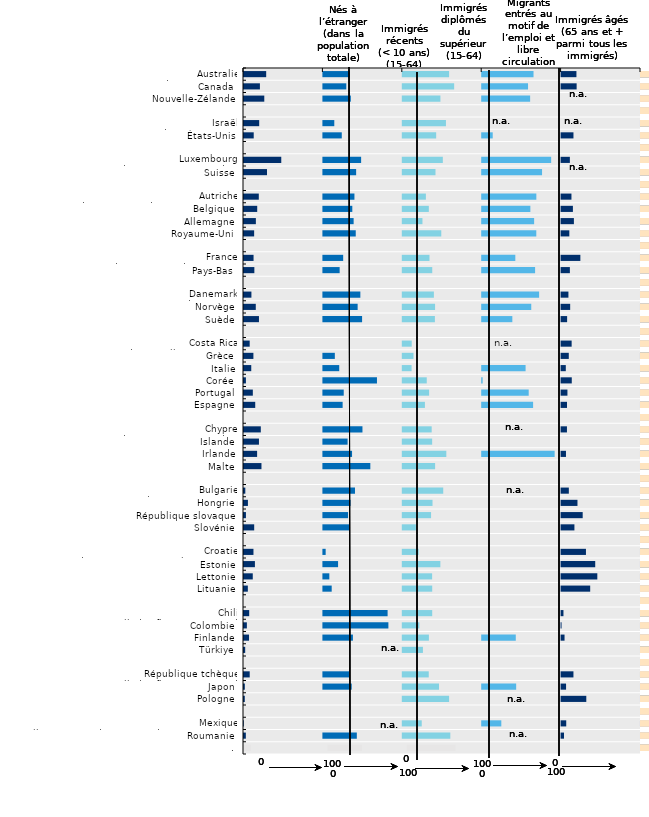
| Category | Nés à l’étranger (dans la
population
totale)
2021 | Series 9 | Immigrés
récents
(< 10 ans)
(15-64)
2020 | Series 13 | Immigrés
diplômés
du
supérieur (15-64)
2020 | Series 15 | Migrants
entrés au
motif de
l’emploi et
libre
circulation (2015-20) | Series 17 | Immigrés
âgés
(65 ans et
+) 2020 | Series 19 | Series 21 | Series 23 | Series 25 | Series 27 | Series 29 | Series 1 | Series 3 | Series 5 | Series 12 | Series 7 | Series 31 | Series 33 | Series 35 | Series 37 | Series 39 |
|---|---|---|---|---|---|---|---|---|---|---|---|---|---|---|---|---|---|---|---|---|---|---|---|---|---|
| 0 | 29.2 | 70.8 | 34.567 | 65.433 | 59.563 | 40.437 | 65.895 | 34.105 | 19.941 | 80.059 | 70.8 | 65.433 | 40.437 | 34.105 | 80.059 | 70.8 | 65.433 | 40.437 | 34.105 | 80.059 | 70.8 | 65.433 | 40.437 | 34.105 | 80.059 |
| 1 | 21.298 | 78.702 | 30.103 | 69.897 | 65.942 | 34.058 | 58.993 | 41.007 | 20.205 | 79.795 | 78.702 | 69.897 | 34.058 | 41.007 | 79.795 | 78.702 | 69.897 | 34.058 | 41.007 | 79.795 | 78.702 | 69.897 | 34.058 | 41.007 | 79.795 |
| 2 | 26.813 | 73.187 | 35.769 | 64.231 | 48.642 | 51.358 | 61.633 | 38.367 | 0 | 100 | 73.187 | 64.231 | 51.358 | 38.367 | 100 | 73.187 | 64.231 | 51.358 | 38.367 | 100 | 73.187 | 64.231 | 51.358 | 38.367 | 100 |
| 3 | 0 | 100 | 0 | 100 | 0 | 100 | 0 | 100 | 0 | 100 | 100 | 100 | 100 | 100 | 100 | 100 | 100 | 100 | 100 | 100 | 100 | 100 | 100 | 100 | 100 |
| 4 | 20.4 | 79.6 | 14.974 | 85.026 | 55.59 | 44.41 | 0 | 100 | 0 | 100 | 79.6 | 85.026 | 44.41 | 100 | 100 | 79.6 | 85.026 | 44.41 | 100 | 100 | 79.6 | 85.026 | 44.41 | 100 | 100 |
| 5 | 13.5 | 86.5 | 24.397 | 75.603 | 43.287 | 56.713 | 14.513 | 85.487 | 16.2 | 83.8 | 86.5 | 75.603 | 56.713 | 85.487 | 83.8 | 86.5 | 75.603 | 56.713 | 85.487 | 83.8 | 86.5 | 75.603 | 56.713 | 85.487 | 83.8 |
| 6 | 0 | 100 | 0 | 100 | 0 | 100 | 0 | 100 | 0 | 100 | 100 | 100 | 100 | 100 | 100 | 100 | 100 | 100 | 100 | 100 | 100 | 100 | 100 | 100 | 100 |
| 7 | 48.2 | 51.8 | 48.771 | 51.229 | 51.677 | 48.323 | 88.115 | 11.885 | 11.675 | 88.325 | 51.8 | 51.229 | 48.323 | 11.885 | 88.325 | 51.8 | 51.229 | 48.323 | 11.885 | 88.325 | 51.8 | 51.229 | 48.323 | 11.885 | 88.325 |
| 8 | 30.2 | 69.8 | 42.49 | 57.51 | 42.431 | 57.569 | 76.639 | 23.361 | 0 | 100 | 69.8 | 57.51 | 57.569 | 23.361 | 100 | 69.8 | 57.51 | 57.569 | 23.361 | 100 | 69.8 | 57.51 | 57.569 | 23.361 | 100 |
| 9 | 0 | 100 | 0 | 100 | 0 | 100 | 0 | 100 | 0 | 100 | 100 | 100 | 100 | 100 | 100 | 100 | 100 | 100 | 100 | 100 | 100 | 100 | 100 | 100 | 100 |
| 10 | 19.9 | 80.1 | 40.346 | 59.654 | 30.329 | 69.671 | 69.449 | 30.551 | 13.67 | 86.33 | 80.1 | 59.654 | 69.671 | 30.551 | 86.33 | 80.1 | 59.654 | 69.671 | 30.551 | 86.33 | 80.1 | 59.654 | 69.671 | 30.551 | 86.33 |
| 11 | 17.9 | 82.1 | 37.666 | 62.334 | 34.037 | 65.963 | 61.92 | 38.08 | 15.49 | 84.51 | 82.1 | 62.334 | 65.963 | 38.08 | 84.51 | 82.1 | 62.334 | 65.963 | 38.08 | 84.51 | 82.1 | 62.334 | 65.963 | 38.08 | 84.51 |
| 12 | 16.2 | 83.8 | 39.337 | 60.663 | 26.01 | 73.99 | 66.656 | 33.344 | 16.755 | 83.245 | 83.8 | 60.663 | 73.99 | 33.344 | 83.245 | 83.8 | 60.663 | 73.99 | 33.344 | 83.245 | 83.8 | 60.663 | 73.99 | 33.344 | 83.245 |
| 13 | 14.041 | 85.959 | 42.001 | 57.999 | 49.718 | 50.282 | 69.389 | 30.611 | 10.99 | 89.01 | 85.959 | 57.999 | 50.282 | 30.611 | 89.01 | 85.959 | 57.999 | 50.282 | 30.611 | 89.01 | 85.959 | 57.999 | 50.282 | 30.611 | 89.01 |
| 14 | 0 | 100 | 0 | 100 | 0 | 100 | 0 | 100 | 0 | 100 | 100 | 100 | 100 | 100 | 100 | 100 | 100 | 100 | 100 | 100 | 100 | 100 | 100 | 100 | 100 |
| 15 | 13.3 | 86.7 | 26.167 | 73.833 | 34.879 | 65.121 | 42.972 | 57.028 | 24.892 | 75.108 | 86.7 | 73.833 | 65.121 | 57.028 | 75.108 | 86.7 | 73.833 | 65.121 | 57.028 | 75.108 | 86.7 | 73.833 | 65.121 | 57.028 | 75.108 |
| 16 | 14.3 | 85.7 | 21.73 | 78.27 | 38.354 | 61.646 | 67.884 | 32.116 | 11.681 | 88.319 | 85.7 | 78.27 | 61.646 | 32.116 | 88.319 | 85.7 | 78.27 | 61.646 | 32.116 | 88.319 | 85.7 | 78.27 | 61.646 | 32.116 | 88.319 |
| 17 | 0 | 100 | 0 | 100 | 0 | 100 | 0 | 100 | 0 | 100 | 100 | 100 | 100 | 100 | 100 | 100 | 100 | 100 | 100 | 100 | 100 | 100 | 100 | 100 | 100 |
| 18 | 10.6 | 89.4 | 47.784 | 52.216 | 40.398 | 59.602 | 72.948 | 27.052 | 9.853 | 90.147 | 89.4 | 52.216 | 59.602 | 27.052 | 90.147 | 89.4 | 52.216 | 59.602 | 27.052 | 90.147 | 89.4 | 52.216 | 59.602 | 27.052 | 90.147 |
| 19 | 16.1 | 83.9 | 44.393 | 55.607 | 41.906 | 58.094 | 63.045 | 36.955 | 12.054 | 87.946 | 83.9 | 55.607 | 58.094 | 36.955 | 87.946 | 83.9 | 55.607 | 58.094 | 36.955 | 87.946 | 83.9 | 55.607 | 58.094 | 36.955 | 87.946 |
| 20 | 20.1 | 79.9 | 49.997 | 50.003 | 41.668 | 58.332 | 39.213 | 60.787 | 8.213 | 91.787 | 79.9 | 50.003 | 58.332 | 60.787 | 91.787 | 79.9 | 50.003 | 58.332 | 60.787 | 91.787 | 79.9 | 50.003 | 58.332 | 60.787 | 91.787 |
| 21 | 0 | 100 | 0 | 100 | 0 | 100 | 0 | 100 | 0 | 100 | 100 | 100 | 100 | 100 | 100 | 100 | 100 | 100 | 100 | 100 | 100 | 100 | 100 | 100 | 100 |
| 22 | 8.43 | 91.57 | 0 | 100 | 12.5 | 87.5 | 0 | 100 | 13.911 | 86.089 | 91.57 | 100 | 87.5 | 100 | 86.089 | 91.57 | 100 | 87.5 | 100 | 86.089 | 91.57 | 100 | 87.5 | 100 | 86.089 |
| 23 | 13.1 | 86.9 | 15.66 | 84.34 | 14.729 | 85.271 | 0 | 100 | 10.308 | 89.692 | 86.9 | 84.34 | 85.271 | 100 | 89.692 | 86.9 | 84.34 | 85.271 | 100 | 89.692 | 86.9 | 84.34 | 85.271 | 100 | 89.692 |
| 24 | 10.4 | 89.6 | 21.202 | 78.798 | 12.311 | 87.689 | 55.901 | 44.099 | 6.55 | 93.45 | 89.6 | 78.798 | 87.689 | 44.099 | 93.45 | 89.6 | 78.798 | 87.689 | 44.099 | 93.45 | 89.6 | 78.798 | 87.689 | 44.099 | 93.45 |
| 25 | 3.683 | 96.317 | 68.719 | 31.281 | 31.423 | 68.577 | 1.826 | 98.174 | 14.071 | 85.929 | 96.317 | 31.281 | 68.577 | 98.174 | 85.929 | 96.317 | 31.281 | 68.577 | 98.174 | 85.929 | 96.317 | 31.281 | 68.577 | 98.174 | 85.929 |
| 26 | 12.382 | 87.618 | 26.864 | 73.136 | 34.403 | 65.597 | 59.827 | 40.173 | 8.61 | 91.39 | 87.618 | 73.136 | 65.597 | 40.173 | 91.39 | 87.618 | 73.136 | 65.597 | 40.173 | 91.39 | 87.618 | 73.136 | 65.597 | 40.173 | 91.39 |
| 27 | 15.4 | 84.6 | 25.484 | 74.516 | 29.106 | 70.894 | 65.37 | 34.63 | 8.095 | 91.905 | 84.6 | 74.516 | 70.894 | 34.63 | 91.905 | 84.6 | 74.516 | 70.894 | 34.63 | 91.905 | 84.6 | 74.516 | 70.894 | 34.63 | 91.905 |
| 28 | 0 | 100 | 0 | 100 | 0 | 100 | 0 | 100 | 0 | 100 | 100 | 100 | 100 | 100 | 100 | 100 | 100 | 100 | 100 | 100 | 100 | 100 | 100 | 100 | 100 |
| 29 | 22.433 | 77.567 | 50.45 | 49.55 | 37.628 | 62.372 | 0 | 100 | 7.998 | 92.002 | 77.567 | 49.55 | 62.372 | 100 | 92.002 | 77.567 | 49.55 | 62.372 | 100 | 92.002 | 77.567 | 49.55 | 62.372 | 100 | 92.002 |
| 30 | 20.1 | 79.9 | 31.747 | 68.253 | 38.228 | 61.772 | 0 | 100 | 0 | 100 | 79.9 | 68.253 | 61.772 | 100 | 100 | 79.9 | 68.253 | 61.772 | 100 | 100 | 79.9 | 68.253 | 61.772 | 100 | 100 |
| 31 | 17.772 | 82.228 | 37.349 | 62.651 | 56.069 | 43.931 | 92.498 | 7.502 | 6.766 | 93.234 | 82.228 | 62.651 | 43.931 | 7.502 | 93.234 | 82.228 | 62.651 | 43.931 | 7.502 | 93.234 | 82.228 | 62.651 | 43.931 | 7.502 | 93.234 |
| 32 | 23.256 | 76.744 | 60.365 | 39.635 | 41.962 | 58.038 | 0 | 100 | 0 | 100 | 76.744 | 39.635 | 58.038 | 100 | 100 | 76.744 | 39.635 | 58.038 | 100 | 100 | 76.744 | 39.635 | 58.038 | 100 | 100 |
| 33 | 0 | 100 | 0 | 100 | 0 | 100 | 0 | 100 | 0 | 100 | 100 | 100 | 100 | 100 | 100 | 100 | 100 | 100 | 100 | 100 | 100 | 100 | 100 | 100 | 100 |
| 34 | 2.92 | 97.08 | 41.042 | 58.958 | 52.181 | 47.819 | 0 | 100 | 10.371 | 89.629 | 97.08 | 58.958 | 47.819 | 100 | 89.629 | 97.08 | 58.958 | 47.819 | 100 | 89.629 | 97.08 | 58.958 | 47.819 | 100 | 89.629 |
| 35 | 6.2 | 93.8 | 35.486 | 64.514 | 38.68 | 61.32 | 0 | 100 | 21.248 | 78.752 | 93.8 | 64.514 | 61.32 | 100 | 78.752 | 93.8 | 64.514 | 61.32 | 100 | 78.752 | 93.8 | 64.514 | 61.32 | 100 | 78.752 |
| 36 | 3.7 | 96.3 | 32.324 | 67.676 | 36.85 | 63.15 | 0 | 100 | 27.821 | 72.179 | 96.3 | 67.676 | 63.15 | 100 | 72.179 | 96.3 | 67.676 | 63.15 | 100 | 72.179 | 96.3 | 67.676 | 63.15 | 100 | 72.179 |
| 37 | 14.1 | 85.9 | 33.573 | 66.427 | 17.736 | 82.264 | 0 | 100 | 17.411 | 82.589 | 85.9 | 66.427 | 82.264 | 100 | 82.589 | 85.9 | 66.427 | 82.264 | 100 | 82.589 | 85.9 | 66.427 | 82.264 | 100 | 82.589 |
| 38 | 0 | 100 | 0 | 100 | 0 | 100 | 0 | 100 | 0 | 100 | 100 | 100 | 100 | 100 | 100 | 100 | 100 | 100 | 100 | 100 | 100 | 100 | 100 | 100 | 100 |
| 39 | 13.181 | 86.819 | 4.107 | 95.893 | 21.169 | 78.831 | 0 | 100 | 31.935 | 68.065 | 86.819 | 95.893 | 78.831 | 100 | 68.065 | 86.819 | 95.893 | 78.831 | 100 | 68.065 | 86.819 | 95.893 | 78.831 | 100 | 68.065 |
| 40 | 15 | 85 | 19.732 | 80.268 | 48.568 | 51.432 | 0 | 100 | 43.605 | 56.395 | 85 | 80.268 | 51.432 | 100 | 56.395 | 85 | 80.268 | 51.432 | 100 | 56.395 | 85 | 80.268 | 51.432 | 100 | 56.395 |
| 41 | 12.3 | 87.7 | 8.729 | 91.271 | 38.198 | 61.802 | 0 | 100 | 46.246 | 53.754 | 87.7 | 91.271 | 61.802 | 100 | 53.754 | 87.7 | 91.271 | 61.802 | 100 | 53.754 | 87.7 | 91.271 | 61.802 | 100 | 53.754 |
| 42 | 6.1 | 93.9 | 11.707 | 88.293 | 38.305 | 61.695 | 0 | 100 | 37.273 | 62.727 | 93.9 | 88.293 | 61.695 | 100 | 62.727 | 93.9 | 88.293 | 61.695 | 100 | 62.727 | 93.9 | 88.293 | 61.695 | 100 | 62.727 |
| 43 | 0 | 100 | 0 | 100 | 0 | 100 | 0 | 100 | 0 | 100 | 100 | 100 | 100 | 100 | 100 | 100 | 100 | 100 | 100 | 100 | 100 | 100 | 100 | 100 | 100 |
| 44 | 7.808 | 92.192 | 82.127 | 17.873 | 38.3 | 61.7 | 0 | 100 | 3.6 | 96.4 | 92.192 | 17.873 | 61.7 | 100 | 96.4 | 92.192 | 17.873 | 61.7 | 100 | 96.4 | 92.192 | 17.873 | 61.7 | 100 | 96.4 |
| 45 | 4.87 | 95.13 | 83.11 | 16.89 | 22.1 | 77.9 | 0 | 100 | 1.2 | 98.8 | 95.13 | 16.89 | 77.9 | 100 | 98.8 | 95.13 | 16.89 | 77.9 | 100 | 98.8 | 95.13 | 16.89 | 77.9 | 100 | 98.8 |
| 46 | 7.6 | 92.4 | 38.419 | 61.581 | 34.125 | 65.875 | 43.548 | 56.452 | 4.971 | 95.029 | 92.4 | 61.581 | 65.875 | 56.452 | 95.029 | 92.4 | 61.581 | 65.875 | 56.452 | 95.029 | 92.4 | 61.581 | 65.875 | 56.452 | 95.029 |
| 47 | 2.767 | 97.233 | 0 | 100 | 26.589 | 73.411 | 0 | 100 | 0 | 100 | 97.233 | 100 | 73.411 | 100 | 100 | 97.233 | 100 | 73.411 | 100 | 100 | 97.233 | 100 | 73.411 | 100 | 100 |
| 48 | 0 | 100 | 0 | 100 | 0 | 100 | 0 | 100 | 0 | 100 | 100 | 100 | 100 | 100 | 100 | 100 | 100 | 100 | 100 | 100 | 100 | 100 | 100 | 100 | 100 |
| 49 | 8.451 | 91.549 | 34.225 | 65.775 | 33.937 | 66.063 | 0 | 100 | 16.18 | 83.82 | 91.549 | 65.775 | 66.063 | 100 | 83.82 | 91.549 | 65.775 | 66.063 | 100 | 83.82 | 91.549 | 65.775 | 66.063 | 100 | 83.82 |
| 50 | 2.29 | 97.71 | 36.89 | 63.11 | 46.859 | 53.141 | 44.045 | 55.955 | 6.887 | 93.113 | 97.71 | 63.11 | 53.141 | 55.955 | 93.113 | 97.71 | 63.11 | 53.141 | 55.955 | 93.113 | 97.71 | 63.11 | 53.141 | 55.955 | 93.113 |
| 51 | 2.244 | 97.756 | 0 | 100 | 59.559 | 40.441 | 0 | 100 | 32.369 | 67.631 | 97.756 | 100 | 40.441 | 100 | 67.631 | 97.756 | 100 | 40.441 | 100 | 67.631 | 97.756 | 100 | 40.441 | 100 | 67.631 |
| 52 | 0 | 100 | 0 | 100 | 0 | 100 | 0 | 100 | 0 | 100 | 100 | 100 | 100 | 100 | 100 | 100 | 100 | 100 | 100 | 100 | 100 | 100 | 100 | 100 | 100 |
| 53 | 0.94 | 99.06 | 0 | 100 | 25.1 | 74.9 | 25.335 | 74.665 | 7.1 | 92.9 | 99.06 | 100 | 74.9 | 74.665 | 92.9 | 99.06 | 100 | 74.9 | 74.665 | 92.9 | 99.06 | 100 | 74.9 | 74.665 | 92.9 |
| 54 | 3.588 | 96.412 | 43.346 | 56.654 | 61.098 | 38.902 | 0 | 100 | 4.312 | 95.688 | 96.412 | 56.654 | 38.902 | 100 | 95.688 | 96.412 | 56.654 | 38.902 | 100 | 95.688 | 96.412 | 56.654 | 38.902 | 100 | 95.688 |
| 55 | 10 | 96.412 | 43.346 | 56.654 | 61.098 | 38.902 | 0 | 100 | 0 | 95.688 | 96.412 | 56.654 | 38.902 | 100 | 95.688 | 96.412 | 56.654 | 38.902 | 100 | 95.688 | 96.412 | 56.654 | 38.902 | 100 | 95.688 |